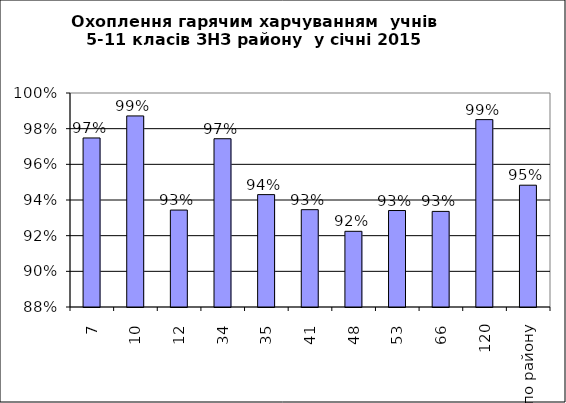
| Category | Series 0 |
|---|---|
| 7 | 0.975 |
| 10 | 0.987 |
| 12 | 0.934 |
| 34 | 0.974 |
| 35 | 0.943 |
| 41 | 0.935 |
| 48 | 0.922 |
| 53 | 0.934 |
| 66 | 0.934 |
| 120 | 0.985 |
| по району | 0.948 |